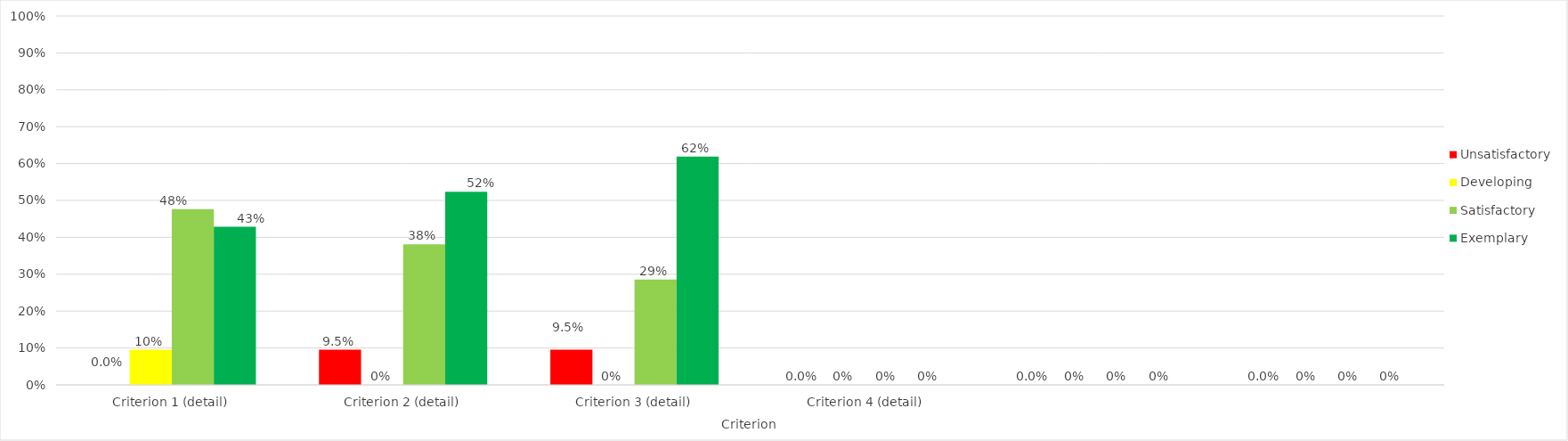
| Category | Unsatisfactory | Developing | Satisfactory | Exemplary |
|---|---|---|---|---|
| Criterion 1 (detail) | 0 | 0.095 | 0.476 | 0.429 |
| Criterion 2 (detail) | 0.095 | 0 | 0.381 | 0.524 |
| Criterion 3 (detail) | 0.095 | 0 | 0.286 | 0.619 |
| Criterion 4 (detail) | 0 | 0 | 0 | 0 |